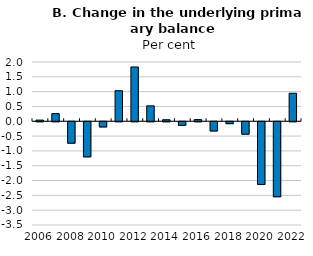
| Category | EU22 |
|---|---|
| 2006.0 | 0.04 |
| 2007.0 | 0.258 |
| 2008.0 | -0.723 |
| 2009.0 | -1.184 |
| 2010.0 | -0.175 |
| 2011.0 | 1.032 |
| 2012.0 | 1.833 |
| 2013.0 | 0.521 |
| 2014.0 | 0.052 |
| 2015.0 | -0.121 |
| 2016.0 | 0.057 |
| 2017.0 | -0.311 |
| 2018.0 | -0.064 |
| 2019.0 | -0.418 |
| 2020.0 | -2.116 |
| 2021.0 | -2.53 |
| 2022.0 | 0.946 |